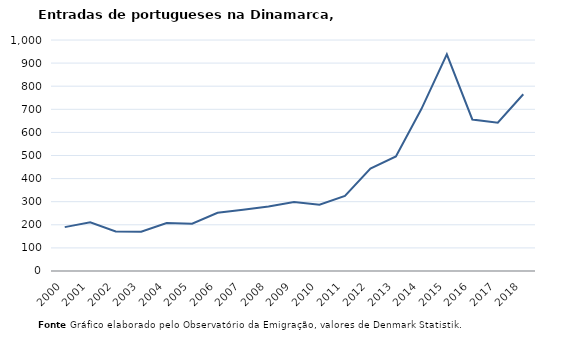
| Category | Entradas |
|---|---|
| 2000.0 | 190 |
| 2001.0 | 211 |
| 2002.0 | 171 |
| 2003.0 | 170 |
| 2004.0 | 208 |
| 2005.0 | 205 |
| 2006.0 | 252 |
| 2007.0 | 265 |
| 2008.0 | 279 |
| 2009.0 | 299 |
| 2010.0 | 287 |
| 2011.0 | 325 |
| 2012.0 | 443 |
| 2013.0 | 496 |
| 2014.0 | 701 |
| 2015.0 | 938 |
| 2016.0 | 656 |
| 2017.0 | 642 |
| 2018.0 | 765 |